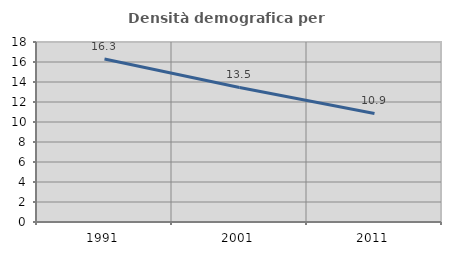
| Category | Densità demografica |
|---|---|
| 1991.0 | 16.3 |
| 2001.0 | 13.456 |
| 2011.0 | 10.851 |